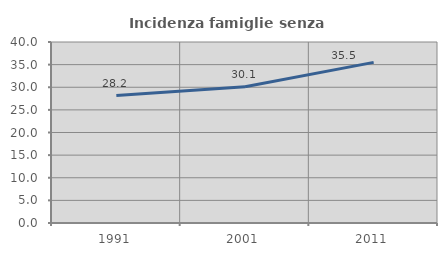
| Category | Incidenza famiglie senza nuclei |
|---|---|
| 1991.0 | 28.151 |
| 2001.0 | 30.123 |
| 2011.0 | 35.503 |